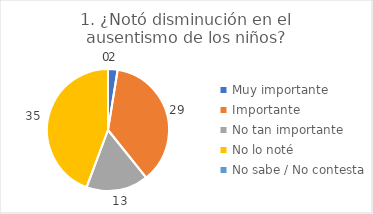
| Category | 1. ¿Notó disminución en el ausentismo de los niños? |
|---|---|
| Muy importante  | 0.025 |
| Importante  | 0.367 |
| No tan importante  | 0.165 |
| No lo noté  | 0.443 |
| No sabe / No contesta | 0 |